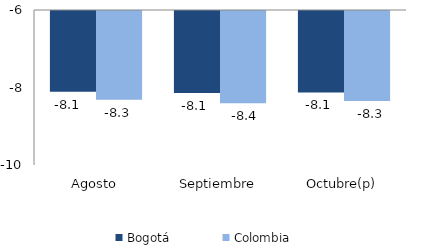
| Category | Bogotá | Colombia |
|---|---|---|
| Agosto | -8.083 | -8.292 |
| Septiembre | -8.116 | -8.381 |
| Octubre(p) | -8.1 | -8.324 |